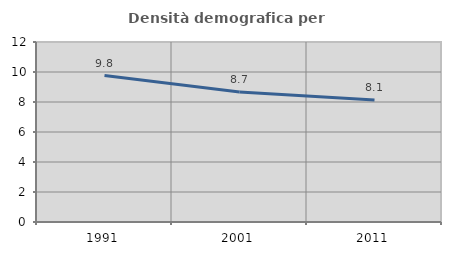
| Category | Densità demografica |
|---|---|
| 1991.0 | 9.761 |
| 2001.0 | 8.674 |
| 2011.0 | 8.131 |